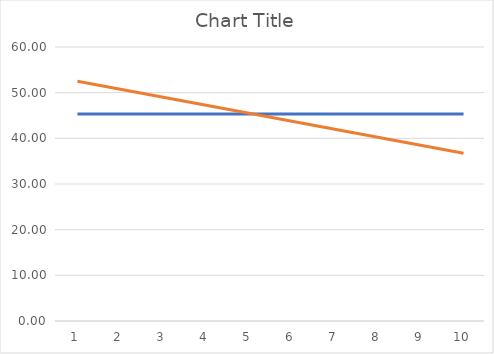
| Category | PREST PRICE | PREST SAC |
|---|---|---|
| 1.0 | 45.327 | 52.5 |
| 2.0 | 45.327 | 50.75 |
| 3.0 | 45.327 | 49 |
| 4.0 | 45.327 | 47.25 |
| 5.0 | 45.327 | 45.5 |
| 6.0 | 45.327 | 43.75 |
| 7.0 | 45.327 | 42 |
| 8.0 | 45.327 | 40.25 |
| 9.0 | 45.327 | 38.5 |
| 10.0 | 45.327 | 36.75 |